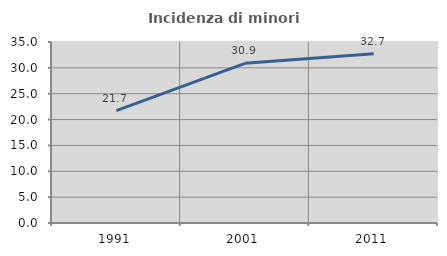
| Category | Incidenza di minori stranieri |
|---|---|
| 1991.0 | 21.739 |
| 2001.0 | 30.882 |
| 2011.0 | 32.737 |